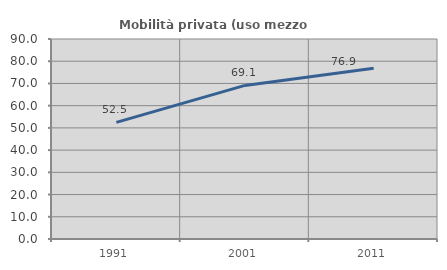
| Category | Mobilità privata (uso mezzo privato) |
|---|---|
| 1991.0 | 52.486 |
| 2001.0 | 69.124 |
| 2011.0 | 76.866 |